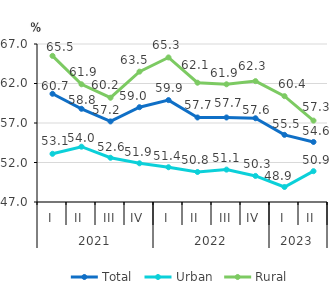
| Category | Total | Urban | Rural |
|---|---|---|---|
| 0 | 60.7 | 53.1 | 65.5 |
| 1 | 58.8 | 54 | 61.9 |
| 2 | 57.2 | 52.6 | 60.2 |
| 3 | 59 | 51.9 | 63.5 |
| 4 | 59.9 | 51.4 | 65.3 |
| 5 | 57.7 | 50.8 | 62.1 |
| 6 | 57.7 | 51.1 | 61.9 |
| 7 | 57.6 | 50.3 | 62.3 |
| 8 | 55.5 | 48.9 | 60.4 |
| 9 | 54.6 | 50.9 | 57.3 |